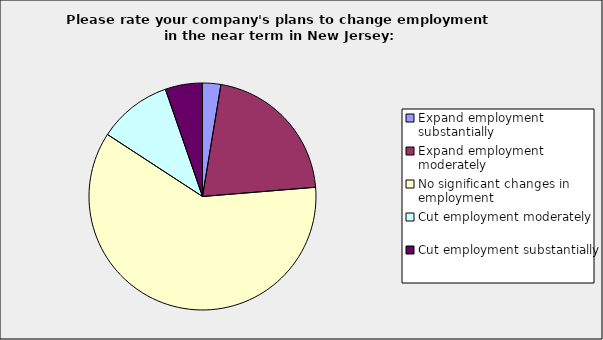
| Category | Series 0 |
|---|---|
| Expand employment substantially | 0.026 |
| Expand employment moderately | 0.211 |
| No significant changes in employment | 0.605 |
| Cut employment moderately | 0.105 |
| Cut employment substantially | 0.053 |